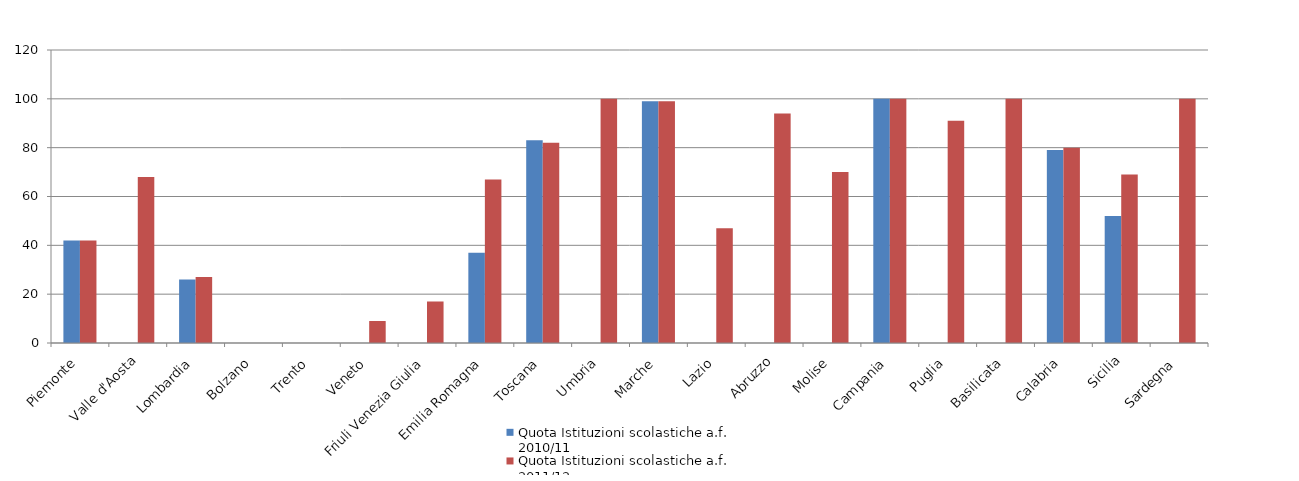
| Category | Quota Istituzioni scolastiche a.f. 2010/11 | Quota Istituzioni scolastiche a.f. 2011/12 |
|---|---|---|
| Piemonte | 42 | 42 |
| Valle d'Aosta | 0 | 68 |
| Lombardia | 26 | 27 |
| Bolzano | 0 | 0 |
| Trento | 0 | 0 |
| Veneto | 0 | 9 |
| Friuli Venezia Giulia | 0 | 17 |
| Emilia Romagna | 37 | 67 |
| Toscana | 83 | 82 |
| Umbria | 0 | 100 |
| Marche | 99 | 99 |
| Lazio | 0 | 47 |
| Abruzzo | 0 | 94 |
| Molise | 0 | 70 |
| Campania | 100 | 100 |
| Puglia | 0 | 91 |
| Basilicata | 0 | 100 |
| Calabria | 79 | 80 |
| Sicilia | 52 | 69 |
| Sardegna | 0 | 100 |